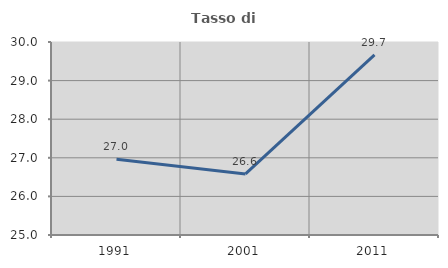
| Category | Tasso di occupazione   |
|---|---|
| 1991.0 | 26.961 |
| 2001.0 | 26.583 |
| 2011.0 | 29.664 |